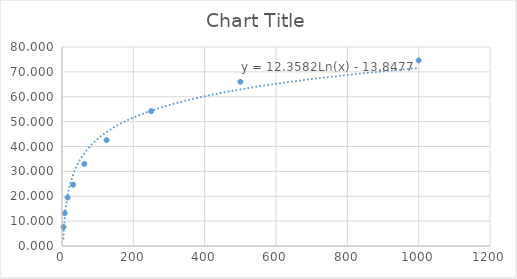
| Category | Series 0 |
|---|---|
| 3.91 | 7.634 |
| 7.81 | 13.168 |
| 15.62 | 19.466 |
| 31.25 | 24.618 |
| 62.5 | 33.015 |
| 125.0 | 42.557 |
| 250.0 | 54.198 |
| 500.0 | 66.031 |
| 1000.0 | 74.618 |